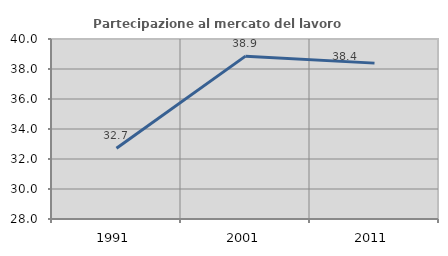
| Category | Partecipazione al mercato del lavoro  femminile |
|---|---|
| 1991.0 | 32.721 |
| 2001.0 | 38.857 |
| 2011.0 | 38.392 |